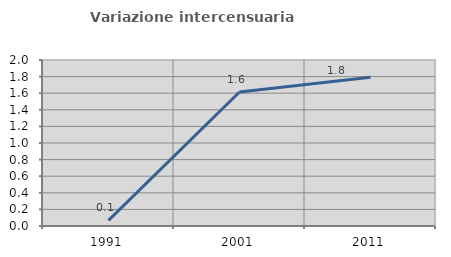
| Category | Variazione intercensuaria annua |
|---|---|
| 1991.0 | 0.068 |
| 2001.0 | 1.615 |
| 2011.0 | 1.793 |